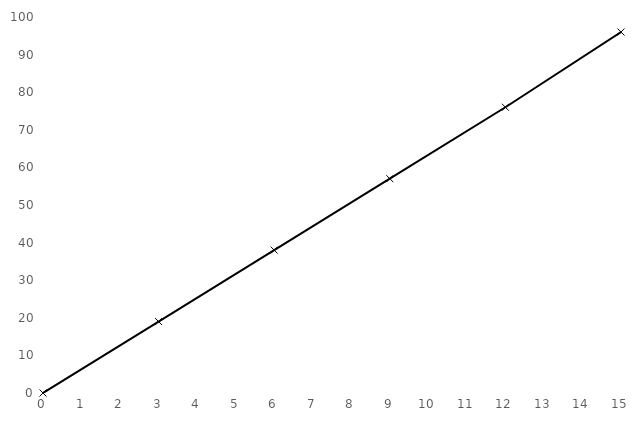
| Category | S in cm |
|---|---|
| 0.0 | 0 |
| 3.0 | 19 |
| 6.0 | 38 |
| 9.0 | 57 |
| 12.0 | 76 |
| 15.0 | 96 |